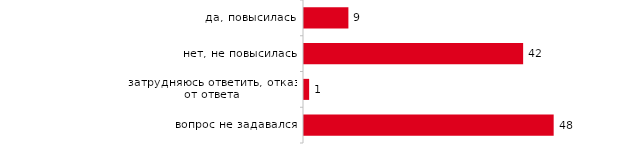
| Category | Series 0 |
|---|---|
| да, повысилась | 8.564 |
| нет, не повысилась | 42.277 |
| затрудняюсь ответить, отказ от ответа | 0.99 |
| вопрос не задавался | 48.168 |